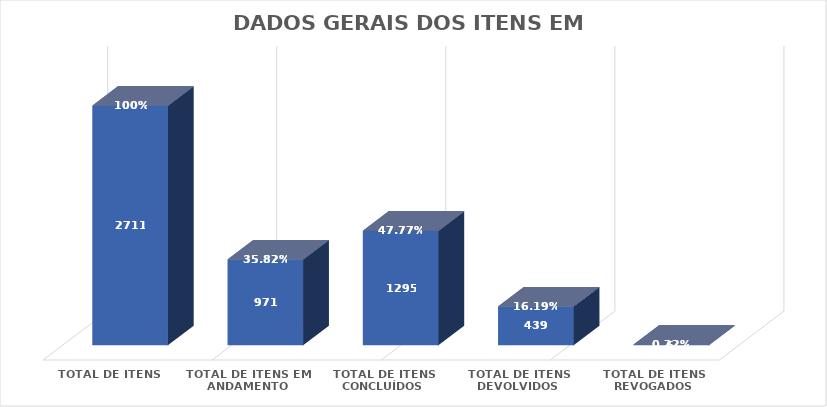
| Category | Series 0 | Series 1 |
|---|---|---|
| Total de itens  | 2711 | 1 |
| Total de itens em andamento | 971 | 0.358 |
| Total de itens concluídos | 1295 | 0.478 |
| Total de itens devolvidos | 439 | 0.162 |
| Total de itens revogados | 6 | 0.002 |